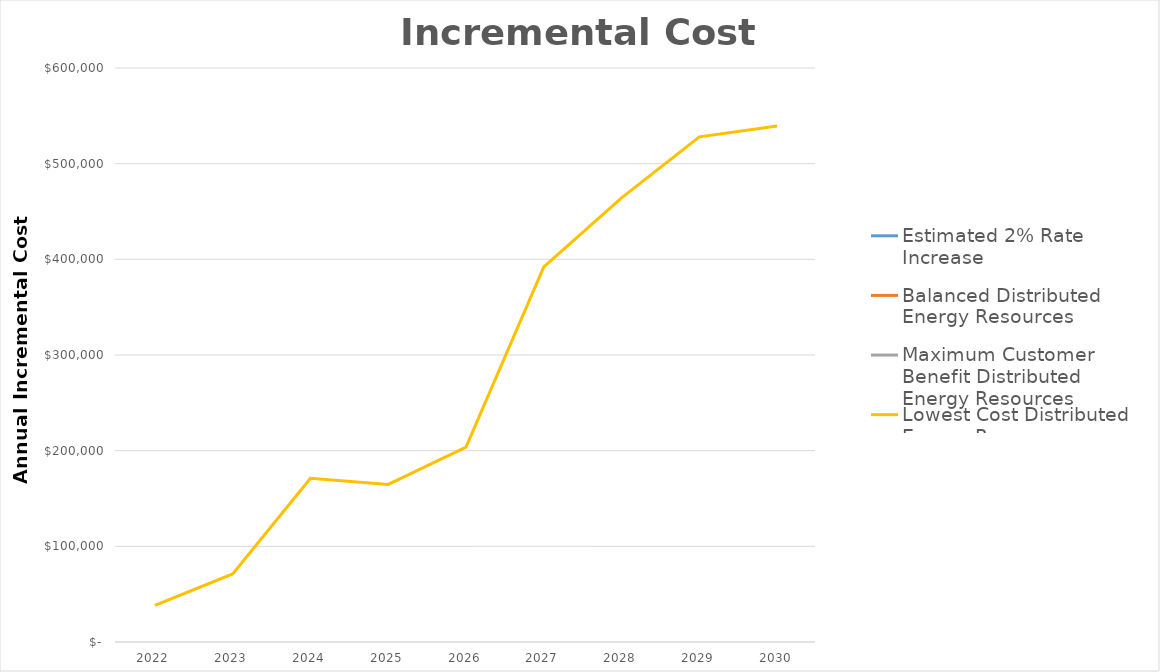
| Category | Estimated 2% Rate Increase | Balanced Distributed Energy Resources | Maximum Customer Benefit Distributed Energy Resources | Lowest Cost Distributed Energy Resources |
|---|---|---|---|---|
| 2022.0 |  |  |  | 38322.98 |
| 2023.0 |  |  |  | 71189.798 |
| 2024.0 |  |  |  | 171223.074 |
| 2025.0 |  |  |  | 164758.774 |
| 2026.0 |  |  |  | 203664.848 |
| 2027.0 |  |  |  | 392024.697 |
| 2028.0 |  |  |  | 464282.004 |
| 2029.0 |  |  |  | 528064.698 |
| 2030.0 |  |  |  | 539435.613 |